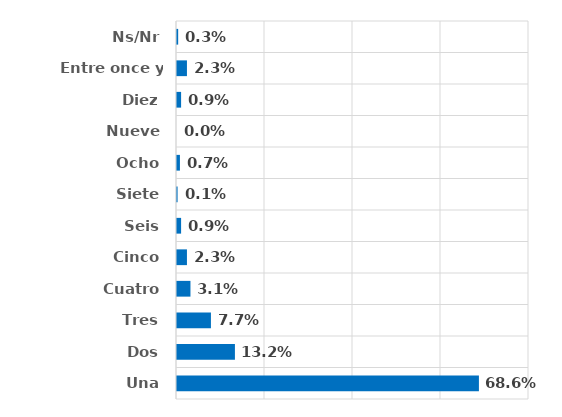
| Category | Series 0 |
|---|---|
| Una | 0.686 |
| Dos | 0.132 |
| Tres | 0.077 |
| Cuatro | 0.031 |
| Cinco | 0.023 |
| Seis | 0.009 |
| Siete | 0.001 |
| Ocho | 0.007 |
| Nueve | 0 |
| Diez | 0.009 |
| Entre once y veinte | 0.023 |
| Ns/Nr | 0.003 |